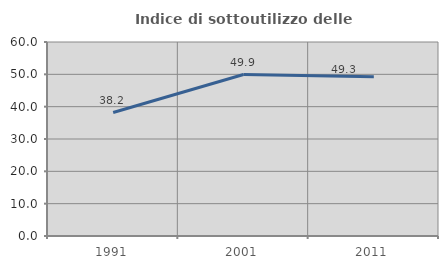
| Category | Indice di sottoutilizzo delle abitazioni  |
|---|---|
| 1991.0 | 38.192 |
| 2001.0 | 49.931 |
| 2011.0 | 49.258 |